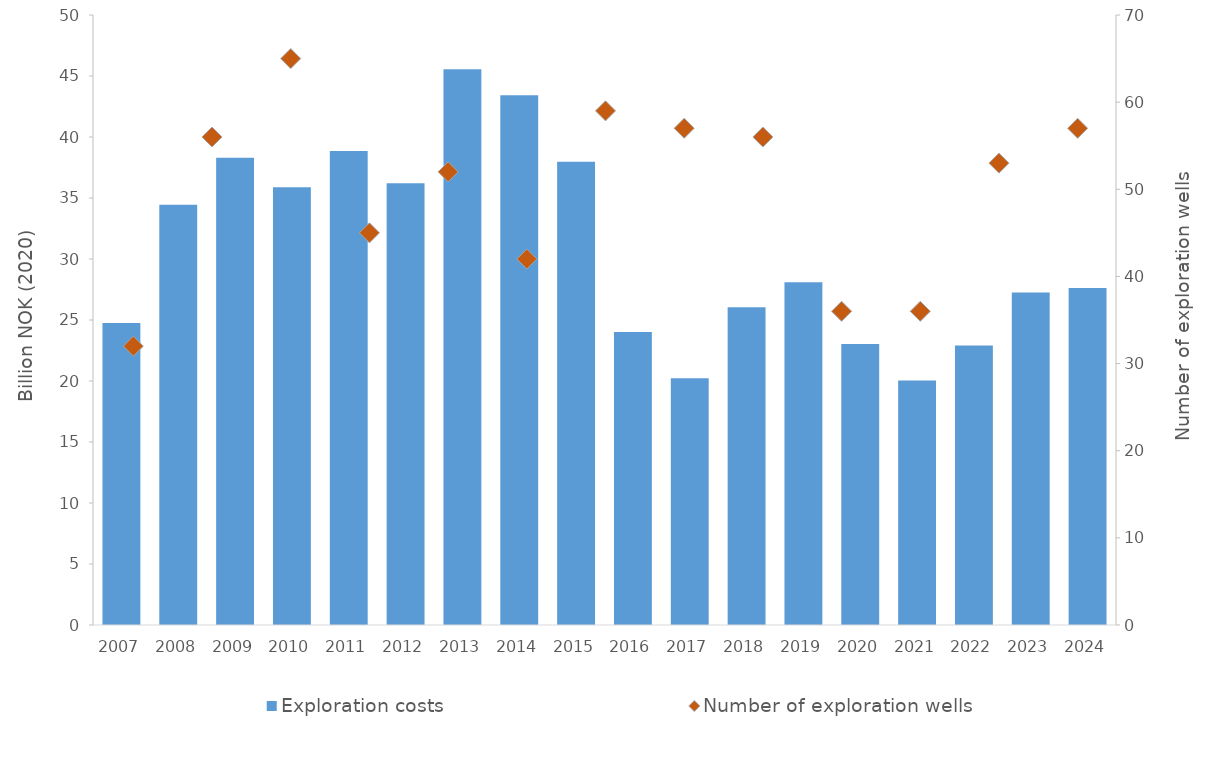
| Category | Exploration costs |
|---|---|
| 2007.0 | 24.758 |
| 2008.0 | 34.455 |
| 2009.0 | 38.298 |
| 2010.0 | 35.891 |
| 2011.0 | 38.852 |
| 2012.0 | 36.2 |
| 2013.0 | 45.561 |
| 2014.0 | 43.412 |
| 2015.0 | 37.972 |
| 2016.0 | 24.023 |
| 2017.0 | 20.218 |
| 2018.0 | 26.052 |
| 2019.0 | 28.086 |
| 2020.0 | 23.033 |
| 2021.0 | 20.04 |
| 2022.0 | 22.902 |
| 2023.0 | 27.259 |
| 2024.0 | 27.614 |